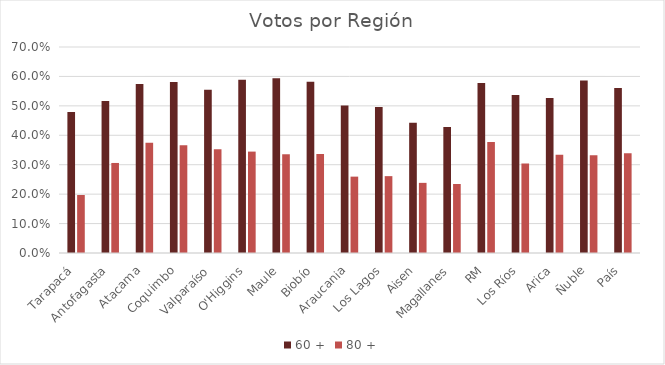
| Category | 60 + | 80 + |
|---|---|---|
| Tarapacá | 0.479 | 0.197 |
| Antofagasta | 0.516 | 0.306 |
| Atacama | 0.575 | 0.375 |
| Coquimbo | 0.581 | 0.366 |
| Valparaíso | 0.555 | 0.352 |
| O'Higgins | 0.589 | 0.345 |
| Maule | 0.594 | 0.336 |
| Biobío | 0.582 | 0.336 |
| Araucania | 0.502 | 0.26 |
| Los Lagos | 0.496 | 0.261 |
| Aisen | 0.443 | 0.238 |
| Magallanes | 0.428 | 0.234 |
| RM | 0.578 | 0.377 |
| Los Ríos | 0.537 | 0.304 |
| Arica | 0.527 | 0.334 |
| Ñuble | 0.586 | 0.333 |
| País | 0.561 | 0.339 |